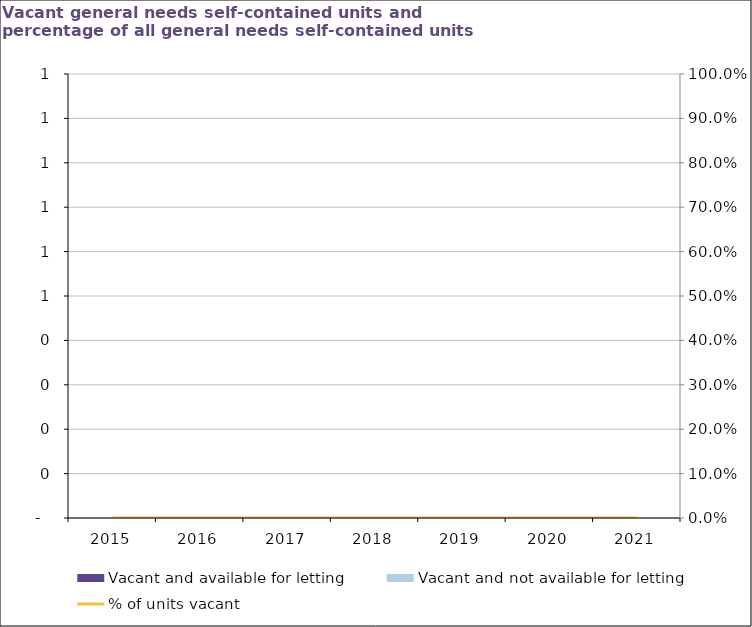
| Category | Vacant and available for letting | Vacant and not available for letting |
|---|---|---|
| 2015.0 | 0 | 0 |
| 2016.0 | 0 | 0 |
| 2017.0 | 0 | 0 |
| 2018.0 | 0 | 0 |
| 2019.0 | 0 | 0 |
| 2020.0 | 0 | 0 |
| 2021.0 | 0 | 0 |